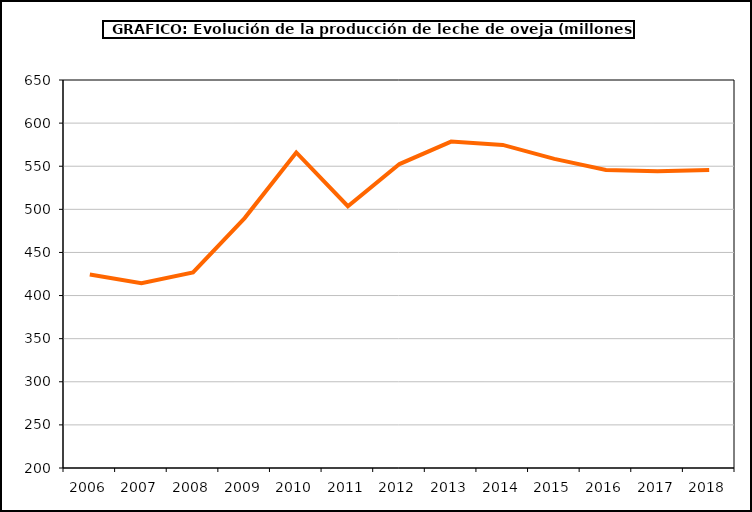
| Category | leche oveja |
|---|---|
| 2006.0 | 424.332 |
| 2007.0 | 414.211 |
| 2008.0 | 426.918 |
| 2009.0 | 489.823 |
| 2010.0 | 565.948 |
| 2011.0 | 503.6 |
| 2012.0 | 552.517 |
| 2013.0 | 578.581 |
| 2014.0 | 574.682 |
| 2015.0 | 558.55 |
| 2016.0 | 545.653 |
| 2017.0 | 544.106 |
| 2018.0 | 545.622 |